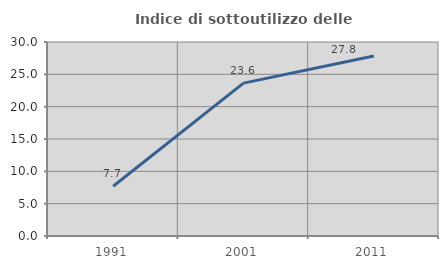
| Category | Indice di sottoutilizzo delle abitazioni  |
|---|---|
| 1991.0 | 7.692 |
| 2001.0 | 23.636 |
| 2011.0 | 27.829 |